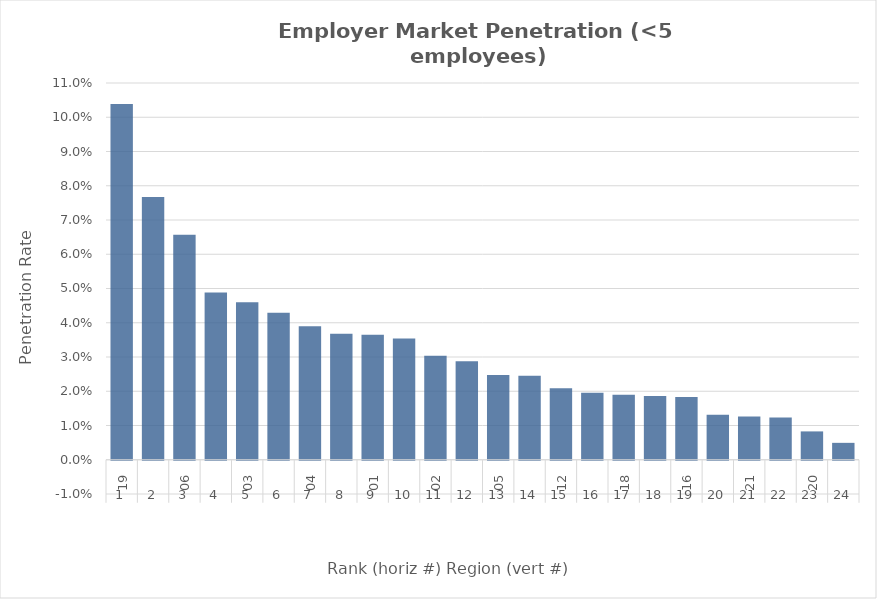
| Category | Rate |
|---|---|
| 0 | 0.104 |
| 1 | 0.077 |
| 2 | 0.066 |
| 3 | 0.049 |
| 4 | 0.046 |
| 5 | 0.043 |
| 6 | 0.039 |
| 7 | 0.037 |
| 8 | 0.036 |
| 9 | 0.035 |
| 10 | 0.03 |
| 11 | 0.029 |
| 12 | 0.025 |
| 13 | 0.025 |
| 14 | 0.021 |
| 15 | 0.02 |
| 16 | 0.019 |
| 17 | 0.019 |
| 18 | 0.018 |
| 19 | 0.013 |
| 20 | 0.013 |
| 21 | 0.012 |
| 22 | 0.008 |
| 23 | 0.005 |